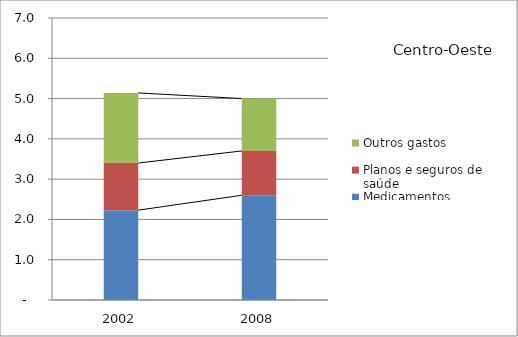
| Category | Medicamentos | Planos e seguros de saúde | Outros gastos |
|---|---|---|---|
| 2002.0 | 2.23 | 1.17 | 1.74 |
| 2008.0 | 2.6 | 1.1 | 1.3 |